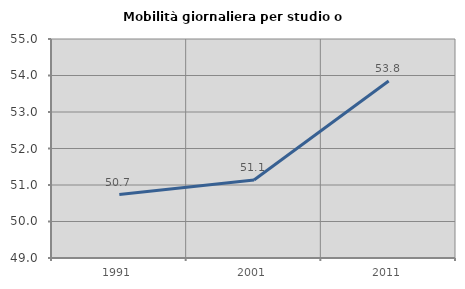
| Category | Mobilità giornaliera per studio o lavoro |
|---|---|
| 1991.0 | 50.737 |
| 2001.0 | 51.136 |
| 2011.0 | 53.848 |